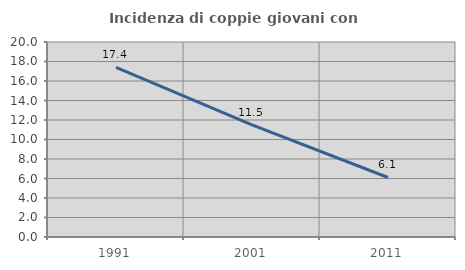
| Category | Incidenza di coppie giovani con figli |
|---|---|
| 1991.0 | 17.399 |
| 2001.0 | 11.504 |
| 2011.0 | 6.104 |